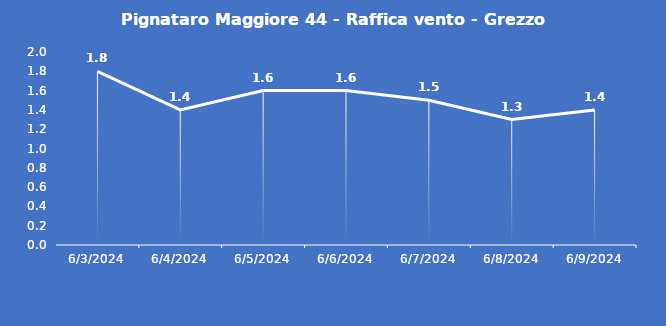
| Category | Pignataro Maggiore 44 - Raffica vento - Grezzo (m/s) |
|---|---|
| 6/3/24 | 1.8 |
| 6/4/24 | 1.4 |
| 6/5/24 | 1.6 |
| 6/6/24 | 1.6 |
| 6/7/24 | 1.5 |
| 6/8/24 | 1.3 |
| 6/9/24 | 1.4 |